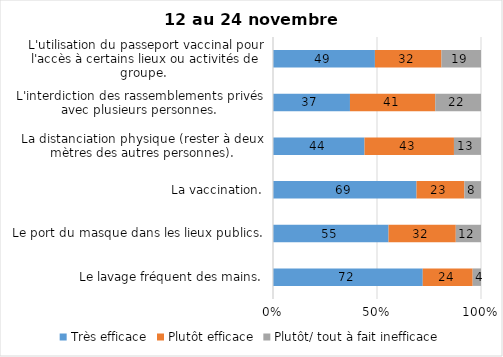
| Category | Très efficace | Plutôt efficace | Plutôt/ tout à fait inefficace |
|---|---|---|---|
| Le lavage fréquent des mains. | 72 | 24 | 4 |
| Le port du masque dans les lieux publics. | 55 | 32 | 12 |
| La vaccination. | 69 | 23 | 8 |
| La distanciation physique (rester à deux mètres des autres personnes). | 44 | 43 | 13 |
| L'interdiction des rassemblements privés avec plusieurs personnes. | 37 | 41 | 22 |
| L'utilisation du passeport vaccinal pour l'accès à certains lieux ou activités de groupe.  | 49 | 32 | 19 |